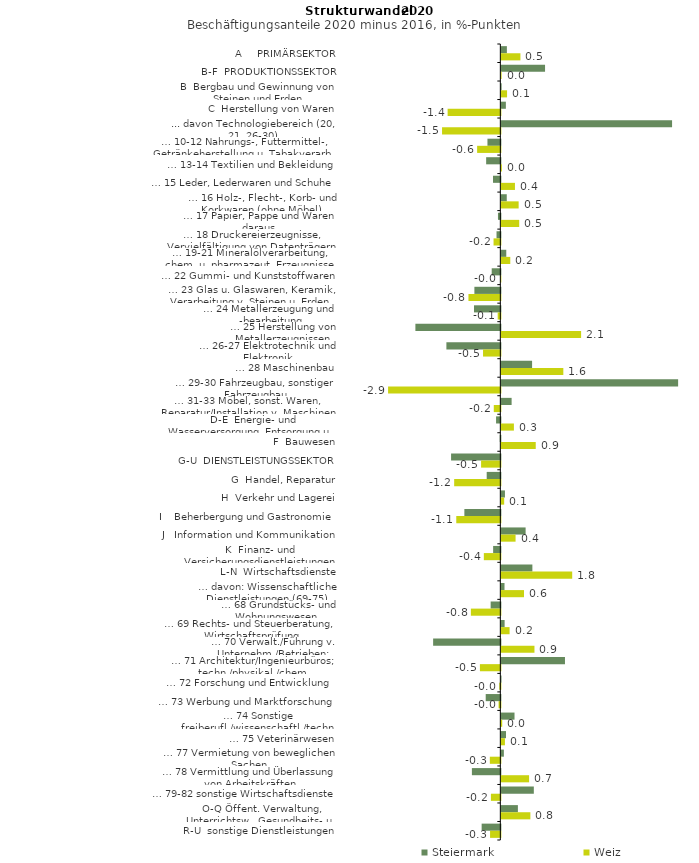
| Category | Steiermark | Weiz |
|---|---|---|
| A     PRIMÄRSEKTOR | 0.145 | 0.498 |
| B-F  PRODUKTIONSSEKTOR | 1.14 | 0.007 |
| B  Bergbau und Gewinnung von Steinen und Erden | 0.008 | 0.15 |
| C  Herstellung von Waren | 0.118 | -1.375 |
| ... davon Technologiebereich (20, 21, 26-30) | 4.454 | -1.521 |
| … 10-12 Nahrungs-, Futtermittel-, Getränkeherstellung u. Tabakverarb. | -0.336 | -0.606 |
| … 13-14 Textilien und Bekleidung | -0.37 | 0.014 |
| … 15 Leder, Lederwaren und Schuhe | -0.191 | 0.355 |
| … 16 Holz-, Flecht-, Korb- und Korkwaren (ohne Möbel)  | 0.142 | 0.452 |
| … 17 Papier, Pappe und Waren daraus  | -0.062 | 0.466 |
| … 18 Druckereierzeugnisse, Vervielfältigung von Datenträgern | -0.099 | -0.177 |
| … 19-21 Mineralölverarbeitung, chem. u. pharmazeut. Erzeugnisse | 0.129 | 0.233 |
| … 22 Gummi- und Kunststoffwaren | -0.225 | -0.002 |
| … 23 Glas u. Glaswaren, Keramik, Verarbeitung v. Steinen u. Erden  | -0.677 | -0.832 |
| … 24 Metallerzeugung und -bearbeitung | -0.687 | -0.069 |
| … 25 Herstellung von Metallerzeugnissen  | -2.216 | 2.081 |
| … 26-27 Elektrotechnik und Elektronik | -1.407 | -0.451 |
| … 28 Maschinenbau | 0.802 | 1.617 |
| … 29-30 Fahrzeugbau, sonstiger Fahrzeugbau | 4.612 | -2.928 |
| … 31-33 Möbel, sonst. Waren, Reparatur/Installation v. Maschinen | 0.268 | -0.171 |
| D-E  Energie- und Wasserversorgung, Entsorgung u. Rückgewinnung | -0.111 | 0.328 |
| F  Bauwesen | -0.015 | 0.897 |
| G-U  DIENSTLEISTUNGSSEKTOR | -1.285 | -0.502 |
| G  Handel, Reparatur | -0.356 | -1.204 |
| H  Verkehr und Lagerei | 0.094 | 0.074 |
| I    Beherbergung und Gastronomie | -0.938 | -1.149 |
| J   Information und Kommunikation | 0.633 | 0.371 |
| K  Finanz- und Versicherungsdienstleistungen | -0.188 | -0.43 |
| L-N  Wirtschaftsdienste | 0.81 | 1.849 |
| … davon: Wissenschaftliche Dienstleistungen (69-75) | 0.083 | 0.592 |
| … 68 Grundstücks- und Wohnungswesen  | -0.253 | -0.769 |
| … 69 Rechts- und Steuerberatung, Wirtschaftsprüfung | 0.086 | 0.215 |
| … 70 Verwalt./Führung v. Unternehm./Betrieben; Unternehmensberat. | -1.753 | 0.864 |
| … 71 Architektur/Ingenieurbüros; techn./physikal./chem. Untersuchung | 1.66 | -0.533 |
| … 72 Forschung und Entwicklung  | 0.004 | -0.027 |
| … 73 Werbung und Marktforschung | -0.382 | -0.046 |
| … 74 Sonstige freiberufl./wissenschaftl./techn. Tätigkeiten | 0.344 | 0.023 |
| … 75 Veterinärwesen | 0.121 | 0.094 |
| … 77 Vermietung von beweglichen Sachen  | 0.066 | -0.274 |
| … 78 Vermittlung und Überlassung von Arbeitskräften | -0.742 | 0.724 |
| … 79-82 sonstige Wirtschaftsdienste | 0.848 | -0.246 |
| O-Q Öffent. Verwaltung, Unterrichtsw., Gesundheits- u. Sozialwesen | 0.432 | 0.758 |
| R-U  sonstige Dienstleistungen | -0.488 | -0.268 |